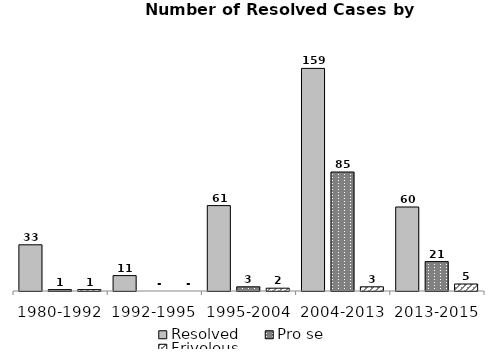
| Category | Resolved | Pro se | Frivolous |
|---|---|---|---|
| 1980-1992 | 33 | 1 | 1 |
| 1992-1995 | 11 | 0 | 0 |
| 1995-2004 | 61 | 3 | 2 |
| 2004-2013 | 159 | 85 | 3 |
| 2013-2015 | 60 | 21 | 5 |